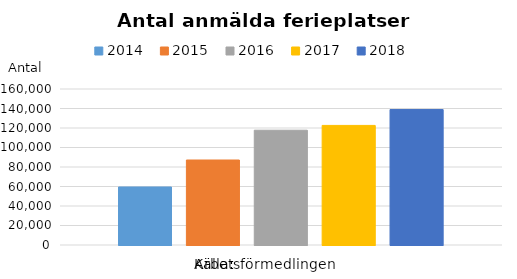
| Category | 2014 | 2015 | 2016 | 2017 | 2018 |
|---|---|---|---|---|---|
| 0 | 59488 | 87167 | 117727 | 122647 | 138941 |